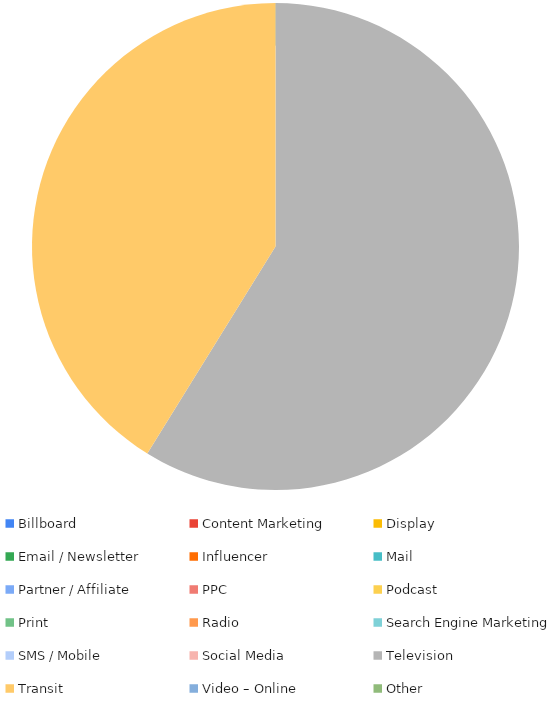
| Category | Series 0 |
|---|---|
| Billboard | 0 |
| Content Marketing | 0 |
| Display | 0 |
| Email / Newsletter | 0 |
| Influencer | 0 |
| Mail | 0 |
| Partner / Affiliate | 0 |
| PPC | 0 |
| Podcast | 0 |
| Print | 0 |
| Radio | 0 |
| Search Engine Marketing | 0 |
| SMS / Mobile | 0 |
| Social Media | 0 |
| Television | 5000 |
| Transit | 3500 |
| Video – Online | 0 |
| Other | 0 |